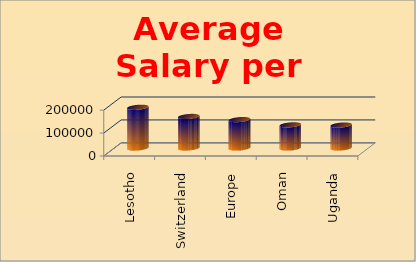
| Category | Total |
|---|---|
| Lesotho | 177600 |
| Switzerland | 137525.557 |
| Europe | 123889.353 |
| Oman | 100800 |
| Uganda | 100000 |